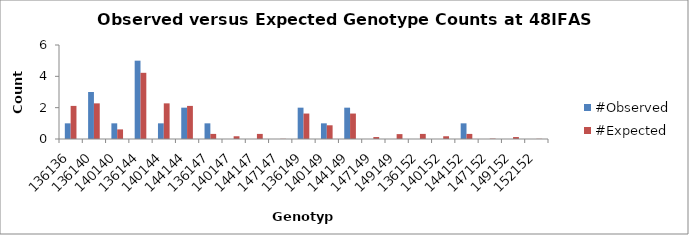
| Category | #Observed | #Expected |
|---|---|---|
| 136136.0 | 1 | 2.112 |
| 136140.0 | 3 | 2.275 |
| 140140.0 | 1 | 0.612 |
| 136144.0 | 5 | 4.225 |
| 140144.0 | 1 | 2.275 |
| 144144.0 | 2 | 2.112 |
| 136147.0 | 1 | 0.325 |
| 140147.0 | 0 | 0.175 |
| 144147.0 | 0 | 0.325 |
| 147147.0 | 0 | 0.012 |
| 136149.0 | 2 | 1.625 |
| 140149.0 | 1 | 0.875 |
| 144149.0 | 2 | 1.625 |
| 147149.0 | 0 | 0.125 |
| 149149.0 | 0 | 0.312 |
| 136152.0 | 0 | 0.325 |
| 140152.0 | 0 | 0.175 |
| 144152.0 | 1 | 0.325 |
| 147152.0 | 0 | 0.025 |
| 149152.0 | 0 | 0.125 |
| 152152.0 | 0 | 0.012 |